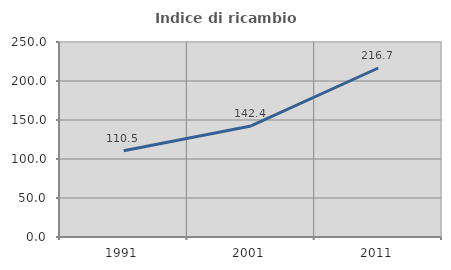
| Category | Indice di ricambio occupazionale  |
|---|---|
| 1991.0 | 110.465 |
| 2001.0 | 142.373 |
| 2011.0 | 216.667 |